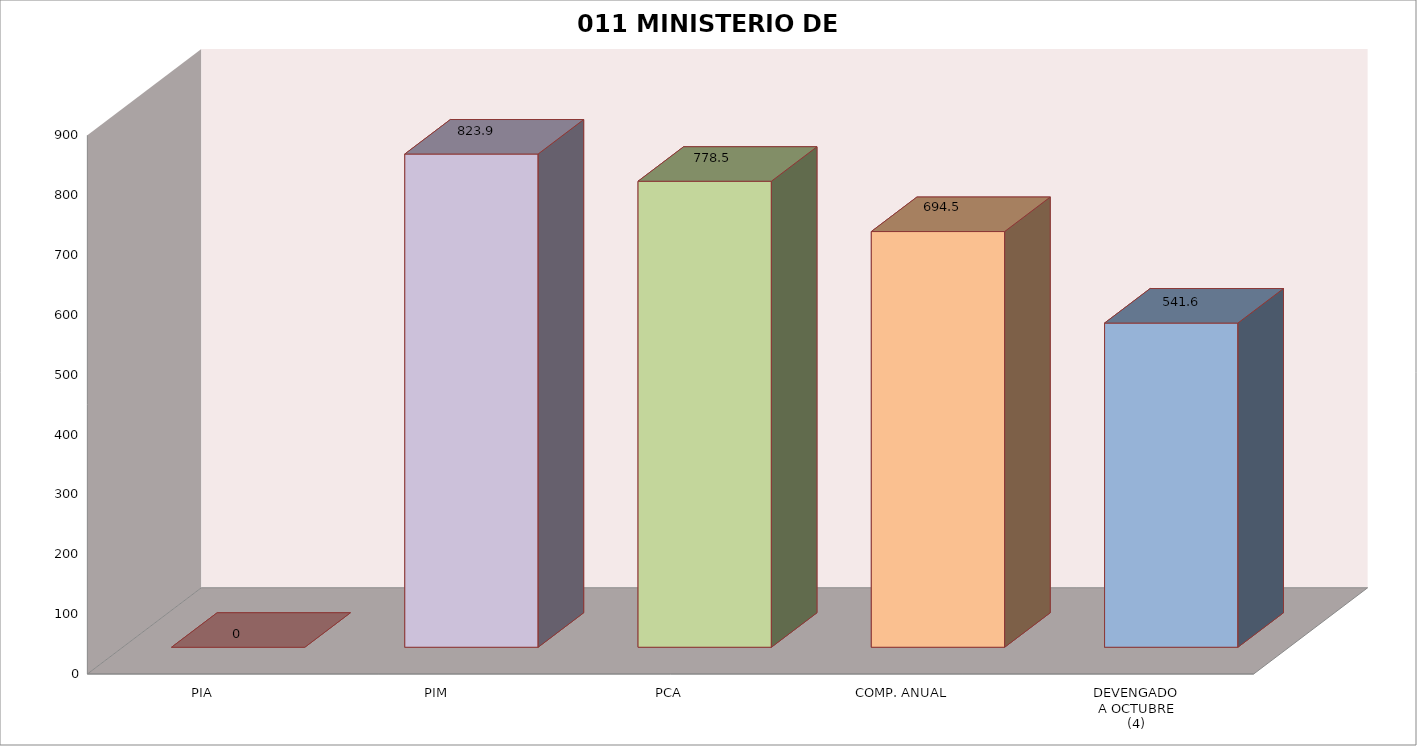
| Category | 011 MINISTERIO DE SALUD |
|---|---|
| PIA | 0 |
| PIM | 823.934 |
| PCA | 778.472 |
| COMP. ANUAL | 694.464 |
| DEVENGADO
A OCTUBRE
(4) | 541.578 |